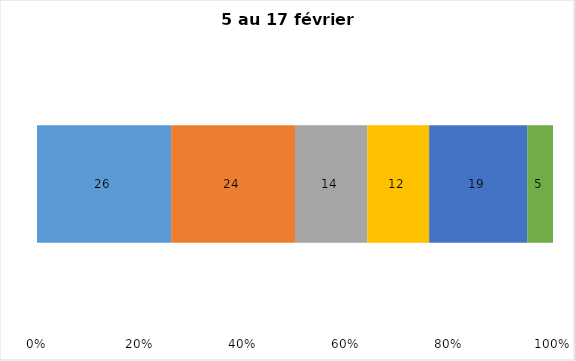
| Category | Plusieurs fois par jour | Une fois par jour | Quelques fois par semaine   | Une fois par semaine ou moins   |  Jamais   |  Je n’utilise pas les médias sociaux |
|---|---|---|---|---|---|---|
| 0 | 26 | 24 | 14 | 12 | 19 | 5 |